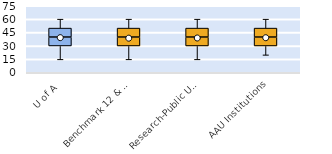
| Category | 25th | 50th | 75th |
|---|---|---|---|
| U of A | 30 | 10 | 10 |
| Benchmark 12 & SEC | 30 | 10 | 10 |
| Research-Public Univ | 30 | 10 | 10 |
| AAU Institutions | 30 | 10 | 10 |